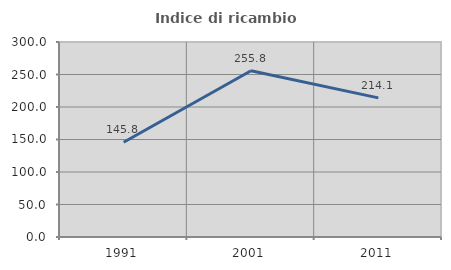
| Category | Indice di ricambio occupazionale  |
|---|---|
| 1991.0 | 145.833 |
| 2001.0 | 255.814 |
| 2011.0 | 214.062 |